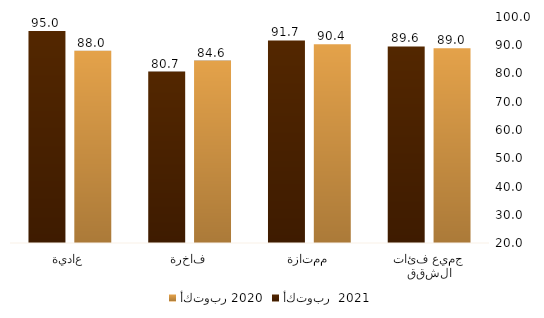
| Category | أكتوبر 2020 | أكتوبر  2021 |
|---|---|---|
| جميع فئات الشقق | 88.972 | 89.562 |
| ممتازة | 90.397 | 91.712 |
| فاخرة | 84.581 | 80.666 |
| عادية | 88.017 | 95.032 |